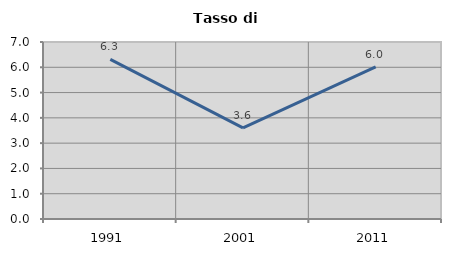
| Category | Tasso di disoccupazione   |
|---|---|
| 1991.0 | 6.31 |
| 2001.0 | 3.606 |
| 2011.0 | 6.019 |